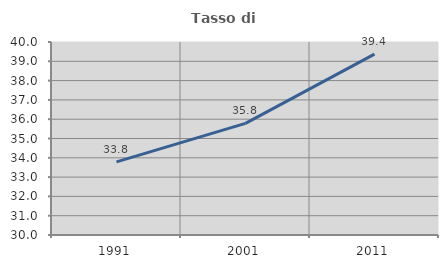
| Category | Tasso di occupazione   |
|---|---|
| 1991.0 | 33.79 |
| 2001.0 | 35.785 |
| 2011.0 | 39.368 |